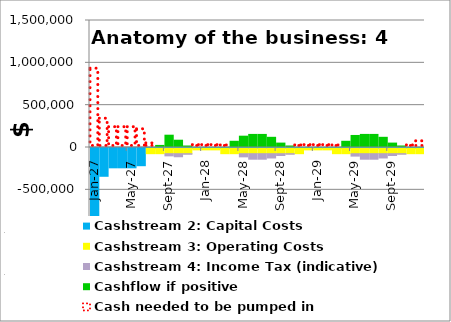
| Category | Cashstream 2: Capital Costs | Cashstream 3: Operating Costs | Cashstream 4: Income Tax (indicative) | Cashflow if positive | Cash needed to be pumped in |
|---|---|---|---|---|---|
| 2027-01-01 | -931000 | 0 | 0 | 0 | 931000 |
| 2027-02-01 | -340000 | 0 | 0 | 0 | 340000 |
| 2027-03-01 | -240000 | 0 | 0 | 0 | 240000 |
| 2027-04-01 | -240000 | 0 | 0 | 0 | 240000 |
| 2027-05-01 | -240000 | 0 | 0 | 0 | 240000 |
| 2027-06-01 | -215000 | 0 | 0 | 0 | 215000 |
| 2027-07-01 | -10000 | -63000 | 0 | 0 | 48600 |
| 2027-08-01 | -10000 | -63000 | 0 | 24600 | 0 |
| 2027-09-01 | -10000 | -63000 | -25731.578 | 145268.422 | 0 |
| 2027-10-01 | -10000 | -63000 | -36125.321 | 86074.679 | 0 |
| 2027-11-01 | -10000 | -63000 | -6833.768 | 17766.232 | 0 |
| 2027-12-01 | -10000 | -18000 | 0 | 0 | 28000 |
| 2028-01-01 | -10000 | -18000 | 0 | 0 | 28000 |
| 2028-02-01 | -10000 | -18000 | 0 | 0 | 28000 |
| 2028-03-01 | -10000 | -63000 | 0 | 0 | 24200 |
| 2028-04-01 | -10000 | -63000 | 0 | 73400 | 0 |
| 2028-05-01 | -10000 | -63000 | -37357.241 | 133642.759 | 0 |
| 2028-06-01 | -10000 | -63000 | -65321.381 | 154478.619 | 0 |
| 2028-07-01 | -10000 | -63000 | -65312.175 | 154487.825 | 0 |
| 2028-08-01 | -10000 | -63000 | -50663.234 | 120336.766 | 0 |
| 2028-09-01 | -10000 | -63000 | -21374.553 | 52025.447 | 0 |
| 2028-10-01 | -10000 | -63000 | -6726.126 | 17873.874 | 0 |
| 2028-11-01 | -10000 | -63000 | 0 | 0 | 24200 |
| 2028-12-01 | -10000 | -18000 | 0 | 0 | 28000 |
| 2029-01-01 | -10000 | -18000 | 0 | 0 | 28000 |
| 2029-02-01 | -10000 | -18000 | 0 | 0 | 28000 |
| 2029-03-01 | -10000 | -63000 | 0 | 0 | 24200 |
| 2029-04-01 | -10000 | -63000 | 0 | 73400 | 0 |
| 2029-05-01 | -10000 | -63000 | -28807.131 | 142192.869 | 0 |
| 2029-06-01 | -10000 | -63000 | -65227.214 | 154572.786 | 0 |
| 2029-07-01 | -10000 | -63000 | -65220.837 | 154579.163 | 0 |
| 2029-08-01 | -10000 | -63000 | -50574.664 | 120425.336 | 0 |
| 2029-09-01 | -10000 | -63000 | -21288.691 | 52111.309 | 0 |
| 2029-10-01 | -10000 | -63000 | -6642.911 | 17957.089 | 0 |
| 2029-11-01 | -10000 | -63000 | 0 | 0 | 24200 |
| 2029-12-01 | -10000 | -63000 | 0 | 0 | 73000 |